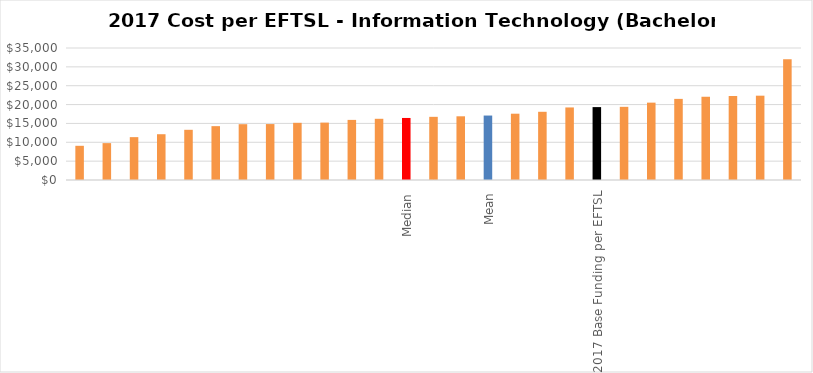
| Category | Series 0 |
|---|---|
|  | 9066.606 |
|  | 9779.256 |
|  | 11365.299 |
|  | 12138.555 |
|  | 13309.051 |
|  | 14279.424 |
|  | 14797.843 |
|  | 14830.041 |
|  | 15161.415 |
|  | 15217.602 |
|  | 15935.933 |
|  | 16229.408 |
| Median | 16449.136 |
|  | 16749.072 |
|  | 16890.291 |
| Mean | 17090 |
|  | 17577.048 |
|  | 18085.713 |
|  | 19238.062 |
| 2017 Base Funding per EFTSL | 19328 |